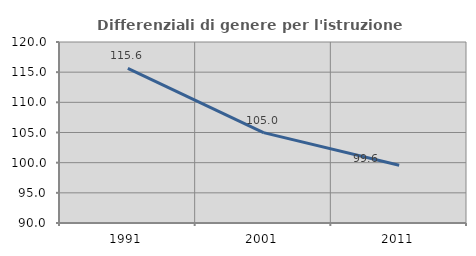
| Category | Differenziali di genere per l'istruzione superiore |
|---|---|
| 1991.0 | 115.626 |
| 2001.0 | 104.98 |
| 2011.0 | 99.573 |